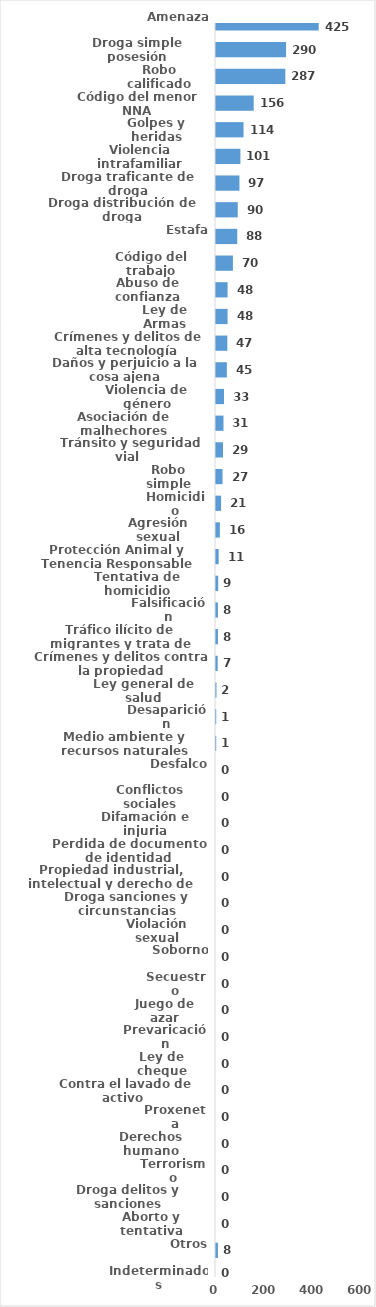
| Category | Series 0 |
|---|---|
| Amenaza | 425 |
| Droga simple posesión | 290 |
| Robo calificado | 287 |
| Código del menor NNA | 156 |
| Golpes y heridas | 114 |
| Violencia intrafamiliar | 101 |
| Droga traficante de droga | 97 |
| Droga distribución de droga | 90 |
| Estafa | 88 |
| Código del trabajo | 70 |
| Abuso de confianza | 48 |
| Ley de Armas | 48 |
| Crímenes y delitos de alta tecnología | 47 |
| Daños y perjuicio a la cosa ajena | 45 |
| Violencia de género | 33 |
| Asociación de malhechores | 31 |
| Tránsito y seguridad vial  | 29 |
| Robo simple | 27 |
| Homicidio | 21 |
| Agresión sexual | 16 |
| Protección Animal y Tenencia Responsable | 11 |
| Tentativa de homicidio | 9 |
| Falsificación | 8 |
| Tráfico ilícito de migrantes y trata de personas | 8 |
| Crímenes y delitos contra la propiedad | 7 |
| Ley general de salud | 2 |
| Desaparición | 1 |
| Medio ambiente y recursos naturales | 1 |
| Desfalco | 0 |
| Conflictos sociales | 0 |
| Difamación e injuria | 0 |
| Perdida de documento de identidad | 0 |
| Propiedad industrial, intelectual y derecho de autor | 0 |
| Droga sanciones y circunstancias agravantes | 0 |
| Violación sexual | 0 |
| Soborno | 0 |
| Secuestro | 0 |
| Juego de azar | 0 |
| Prevaricación | 0 |
| Ley de cheque | 0 |
| Contra el lavado de activo  | 0 |
| Proxeneta | 0 |
| Derechos humano | 0 |
| Terrorismo | 0 |
| Droga delitos y sanciones | 0 |
| Aborto y tentativa | 0 |
| Otros | 8 |
| Indeterminados | 0 |